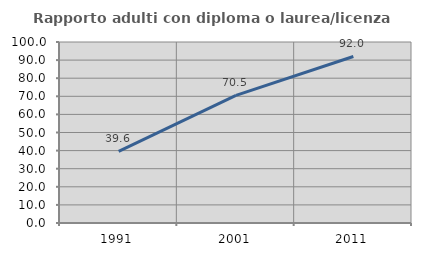
| Category | Rapporto adulti con diploma o laurea/licenza media  |
|---|---|
| 1991.0 | 39.623 |
| 2001.0 | 70.492 |
| 2011.0 | 92 |